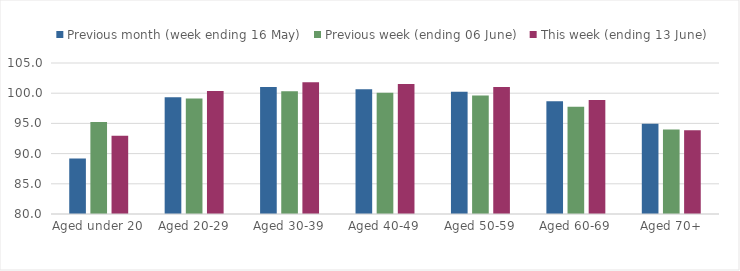
| Category | Previous month (week ending 16 May) | Previous week (ending 06 June) | This week (ending 13 June) |
|---|---|---|---|
| Aged under 20 | 89.193 | 95.233 | 92.953 |
| Aged 20-29 | 99.325 | 99.104 | 100.353 |
| Aged 30-39 | 101.027 | 100.314 | 101.831 |
| Aged 40-49 | 100.661 | 100.064 | 101.536 |
| Aged 50-59 | 100.23 | 99.638 | 101.047 |
| Aged 60-69 | 98.678 | 97.744 | 98.891 |
| Aged 70+ | 94.955 | 93.975 | 93.855 |